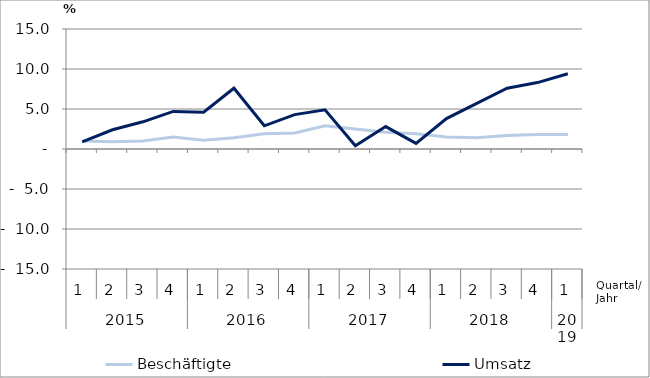
| Category | Beschäftigte | Umsatz |
|---|---|---|
| 0 | 1 | 0.9 |
| 1 | 0.9 | 2.4 |
| 2 | 1 | 3.4 |
| 3 | 1.5 | 4.7 |
| 4 | 1.1 | 4.6 |
| 5 | 1.4 | 7.6 |
| 6 | 1.9 | 2.9 |
| 7 | 2 | 4.3 |
| 8 | 2.9 | 4.9 |
| 9 | 2.5 | 0.4 |
| 10 | 2.1 | 2.8 |
| 11 | 1.9 | 0.7 |
| 12 | 1.5 | 3.8 |
| 13 | 1.4 | 5.7 |
| 14 | 1.7 | 7.6 |
| 15 | 1.8 | 8.3 |
| 16 | 1.8 | 9.4 |